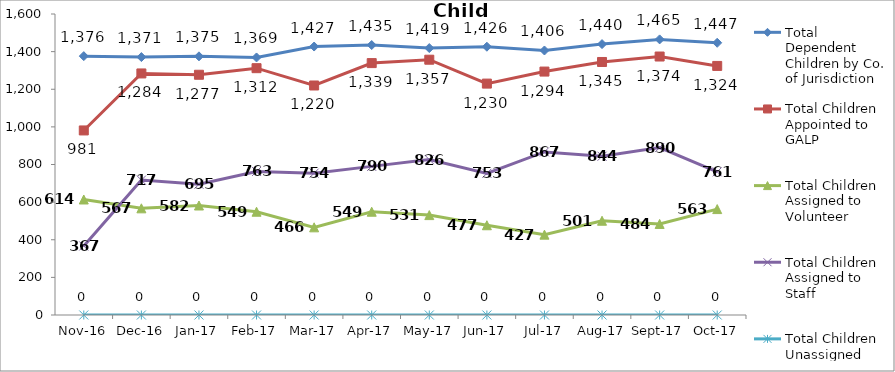
| Category | Total Dependent Children by Co. of Jurisdiction | Total Children Appointed to GALP | Total Children Assigned to Volunteer | Total Children Assigned to Staff | Total Children Unassigned |
|---|---|---|---|---|---|
| 2016-11-01 | 1376 | 981 | 614 | 367 | 0 |
| 2016-12-01 | 1371 | 1284 | 567 | 717 | 0 |
| 2017-01-01 | 1375 | 1277 | 582 | 695 | 0 |
| 2017-02-01 | 1369 | 1312 | 549 | 763 | 0 |
| 2017-03-01 | 1427 | 1220 | 466 | 754 | 0 |
| 2017-04-01 | 1435 | 1339 | 549 | 790 | 0 |
| 2017-05-01 | 1419 | 1357 | 531 | 826 | 0 |
| 2017-06-01 | 1426 | 1230 | 477 | 753 | 0 |
| 2017-07-01 | 1406 | 1294 | 427 | 867 | 0 |
| 2017-08-01 | 1440 | 1345 | 501 | 844 | 0 |
| 2017-09-01 | 1465 | 1374 | 484 | 890 | 0 |
| 2017-10-01 | 1447 | 1324 | 563 | 761 | 0 |